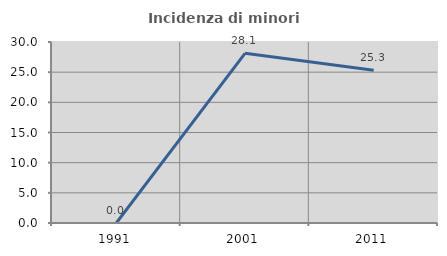
| Category | Incidenza di minori stranieri |
|---|---|
| 1991.0 | 0 |
| 2001.0 | 28.125 |
| 2011.0 | 25.301 |